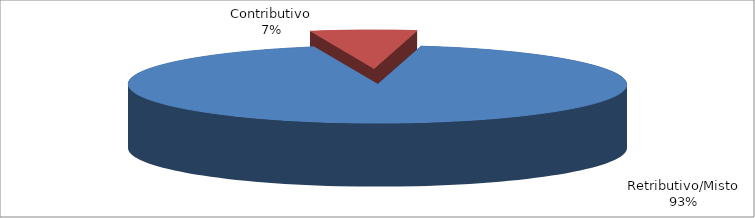
| Category | Series 1 |
|---|---|
| Retributivo/Misto | 330058 |
| Contributivo | 24393 |